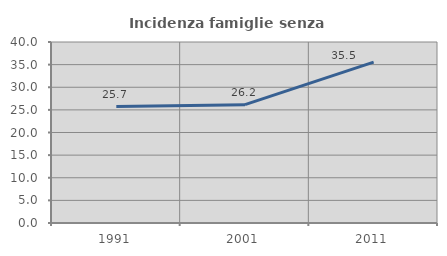
| Category | Incidenza famiglie senza nuclei |
|---|---|
| 1991.0 | 25.736 |
| 2001.0 | 26.153 |
| 2011.0 | 35.549 |